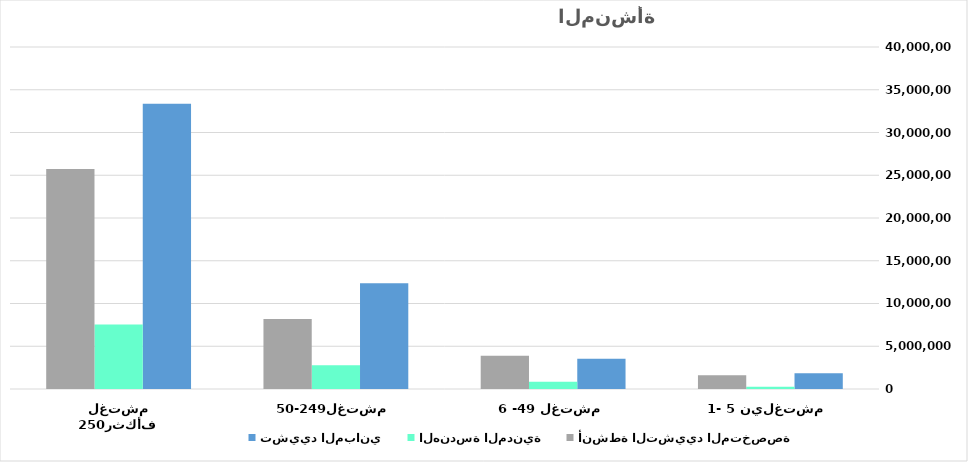
| Category | تشييد المباني | الهندسة المدنية | أنشطة التشييد المتخصصة |
|---|---|---|---|
| 1- 5 مشتغلين | 1856101.264 | 261079.994 | 1599310.045 |
| 6 -49 مشتغل | 3524855.543 | 842884.076 | 3895218.719 |
| 50-249مشتغل | 12359586.78 | 2792150.202 | 8198477.382 |
| 250مشتغل فأكثر | 33368579.713 | 7536517.43 | 25726041.615 |